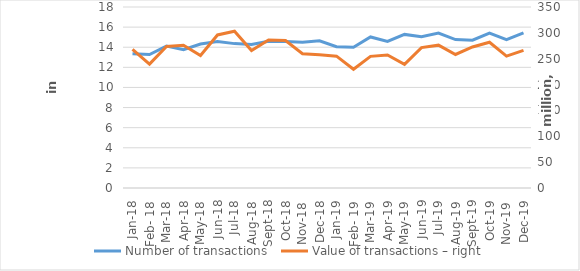
| Category | Number of transactions  |
|---|---|
| sij.18 | 13342931 |
| Feb- 18 | 13272441 |
| ožu.18 | 14113179 |
| tra.18 | 13744326 |
| svi.18 | 14320544 |
| lip.18 | 14562190 |
| srp.18 | 14358474 |
| kol.18 | 14278622 |
| ruj.18 | 14603466 |
| lis.18 | 14562545 |
| stu.18 | 14485909 |
| pro.18 | 14636781 |
| sij.19 | 14051758 |
| Feb- 19 | 13993705 |
| ožu.19 | 15018362 |
| tra.19 | 14573386 |
| svi.19 | 15274233 |
| lip.19 | 15041226 |
| srp.19 | 15403097 |
| kol.19 | 14762747 |
| ruj.19 | 14697605 |
| lis.19 | 15394413 |
| stu.19 | 14755458 |
| pro.19 | 15431812 |